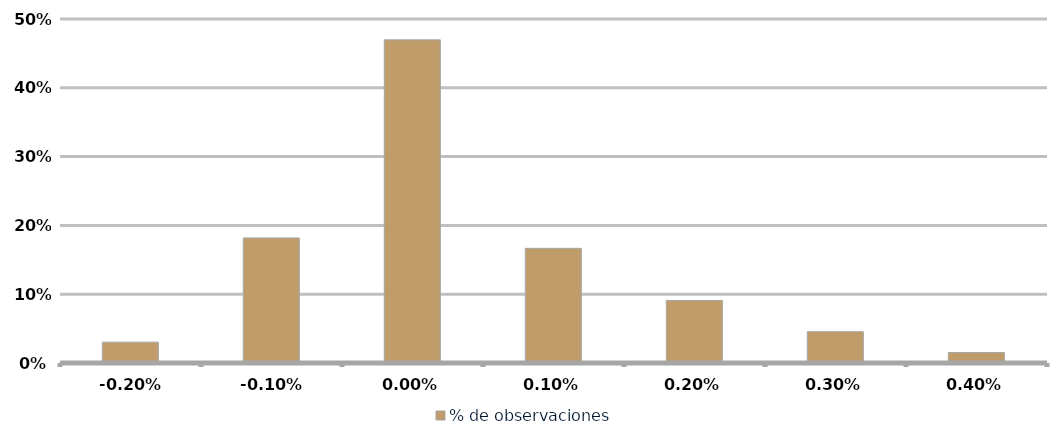
| Category | % de observaciones  |
|---|---|
| -0.002 | 0.03 |
| -0.001 | 0.182 |
| 0.0 | 0.47 |
| 0.001 | 0.167 |
| 0.002 | 0.091 |
| 0.003 | 0.045 |
| 0.004 | 0.015 |